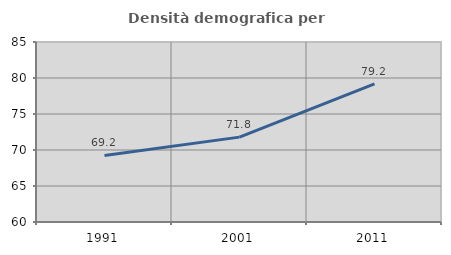
| Category | Densità demografica |
|---|---|
| 1991.0 | 69.241 |
| 2001.0 | 71.787 |
| 2011.0 | 79.185 |